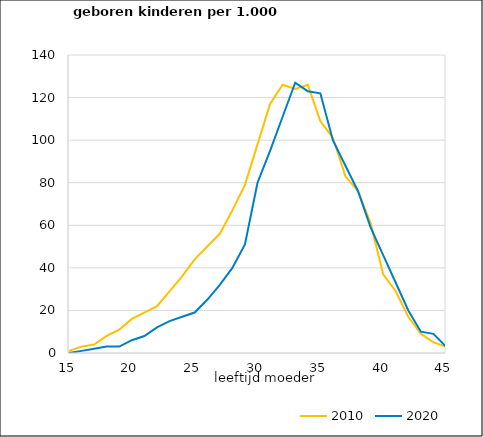
| Category | 2010 | 2020 |
|---|---|---|
| 15.0 | 1 | 0 |
| 16.0 | 3 | 1 |
| 17.0 | 4 | 2 |
| 18.0 | 8 | 3 |
| 19.0 | 11 | 3 |
| 20.0 | 16 | 6 |
| 21.0 | 19 | 8 |
| 22.0 | 22 | 12 |
| 23.0 | 29 | 15 |
| 24.0 | 36 | 17 |
| 25.0 | 44 | 19 |
| 26.0 | 50 | 25 |
| 27.0 | 56 | 32 |
| 28.0 | 67 | 40 |
| 29.0 | 79 | 51 |
| 30.0 | 98 | 80 |
| 31.0 | 117 | 95 |
| 32.0 | 126 | 111 |
| 33.0 | 124 | 127 |
| 34.0 | 126 | 123 |
| 35.0 | 109 | 122 |
| 36.0 | 101 | 100 |
| 37.0 | 83 | 88 |
| 38.0 | 76 | 76 |
| 39.0 | 61 | 59 |
| 40.0 | 37 | 46 |
| 41.0 | 29 | 33 |
| 42.0 | 17 | 20 |
| 43.0 | 9 | 10 |
| 44.0 | 5 | 9 |
| 45.0 | 3 | 3 |